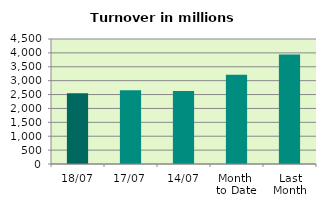
| Category | Series 0 |
|---|---|
| 18/07 | 2545.58 |
| 17/07 | 2655.991 |
| 14/07 | 2630.065 |
| Month 
to Date | 3216.438 |
| Last
Month | 3940.311 |